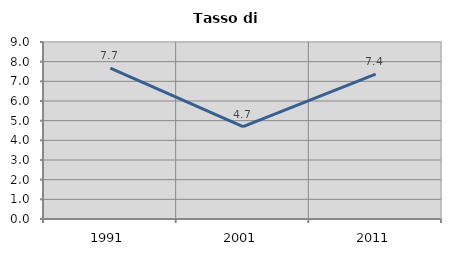
| Category | Tasso di disoccupazione   |
|---|---|
| 1991.0 | 7.666 |
| 2001.0 | 4.693 |
| 2011.0 | 7.37 |